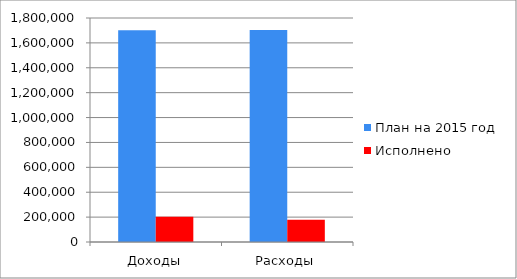
| Category | План на 2015 год | Исполнено  |
|---|---|---|
| Доходы | 1700561 | 203574 |
| Расходы | 1703560 | 179729 |